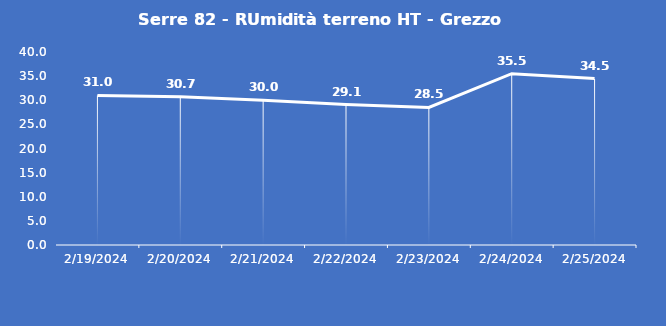
| Category | Serre 82 - RUmidità terreno HT - Grezzo (%VWC) |
|---|---|
| 2/19/24 | 31 |
| 2/20/24 | 30.7 |
| 2/21/24 | 30 |
| 2/22/24 | 29.1 |
| 2/23/24 | 28.5 |
| 2/24/24 | 35.5 |
| 2/25/24 | 34.5 |